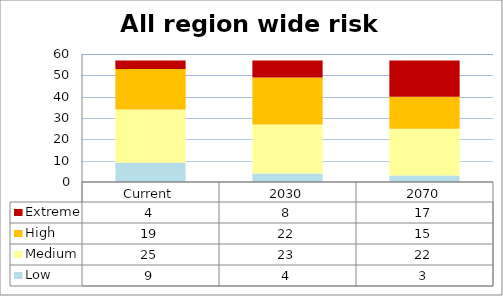
| Category | Low | Medium | High | Extreme |
|---|---|---|---|---|
| Current | 9 | 25 | 19 | 4 |
| 2030 | 4 | 23 | 22 | 8 |
| 2070 | 3 | 22 | 15 | 17 |